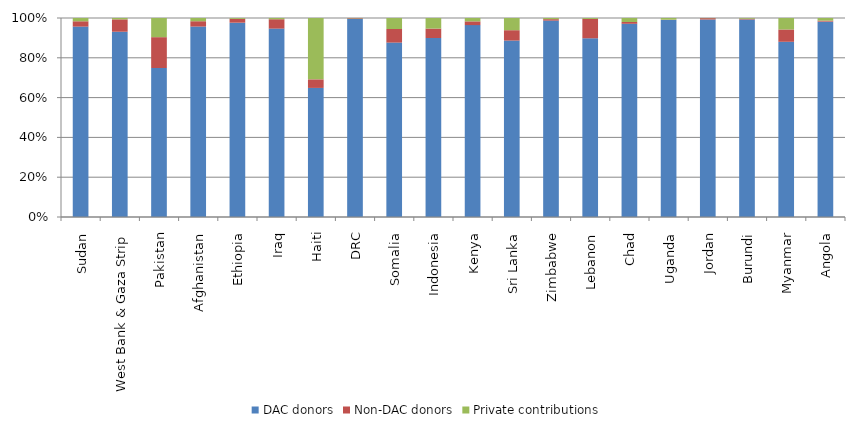
| Category | DAC donors | Non-DAC donors | Private contributions |
|---|---|---|---|
| Sudan | 10161.113 | 284.078 | 174.965 |
| West Bank & Gaza Strip | 6249.245 | 417.121 | 46.239 |
| Pakistan | 4703.961 | 973.86 | 605.024 |
| Afghanistan | 5902.64 | 165.124 | 100.057 |
| Ethiopia | 5782.777 | 115.162 | 24.645 |
| Iraq | 5450.846 | 270.903 | 35.904 |
| Haiti | 2822.261 | 187.461 | 1341.437 |
| DRC | 4169.507 | 13.296 | 5.683 |
| Somalia | 3440.152 | 268.076 | 216.708 |
| Indonesia | 2469.818 | 130.165 | 146.141 |
| Kenya | 2338.159 | 45.653 | 41.102 |
| Sri Lanka | 1818.211 | 106.722 | 125.731 |
| Zimbabwe | 1910.676 | 14.057 | 11.319 |
| Lebanon | 1713.836 | 185.967 | 8.56 |
| Chad | 1678.778 | 15.401 | 34.937 |
| Uganda | 1635.237 | 1.799 | 14.114 |
| Jordan | 1361.326 | 9.121 | 1.17 |
| Burundi | 1188.343 | 4.616 | 4.396 |
| Myanmar | 993.46 | 69.761 | 65.09 |
| Angola | 1097.428 | 5.738 | 14.697 |